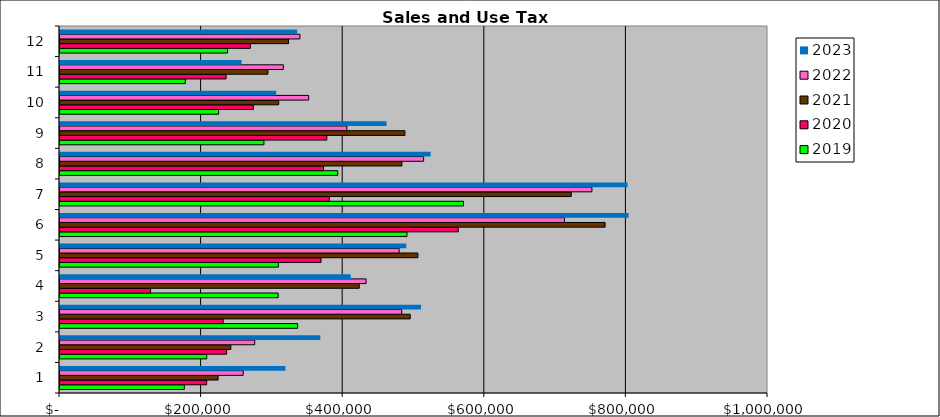
| Category | 2019 | 2020 | 2021 | 2022 | 2023 |
|---|---|---|---|---|---|
| 0 | 175596 | 207167 | 223339 | 258734 | 318511 |
| 1 | 207214 | 235373 | 241316 | 275043 | 367695 |
| 2 | 335634 | 230459 | 494628 | 482644 | 509964 |
| 3 | 308112 | 127981 | 422700 | 432289 | 410613 |
| 4 | 308505 | 368630 | 505501 | 479000 | 489052 |
| 5 | 490070 | 562527 | 769966 | 712496 | 803116 |
| 6 | 569913 | 380495 | 722161 | 751282 | 801686 |
| 7 | 392292 | 372290 | 482858 | 513627 | 523405 |
| 8 | 288079 | 376880 | 487213 | 405112 | 461251 |
| 9 | 224079 | 273111 | 308907 | 351231 | 305310 |
| 10 | 177006 | 234603 | 293743 | 315486 | 256412 |
| 11 | 236658 | 268826 | 322798 | 338890 | 334961 |